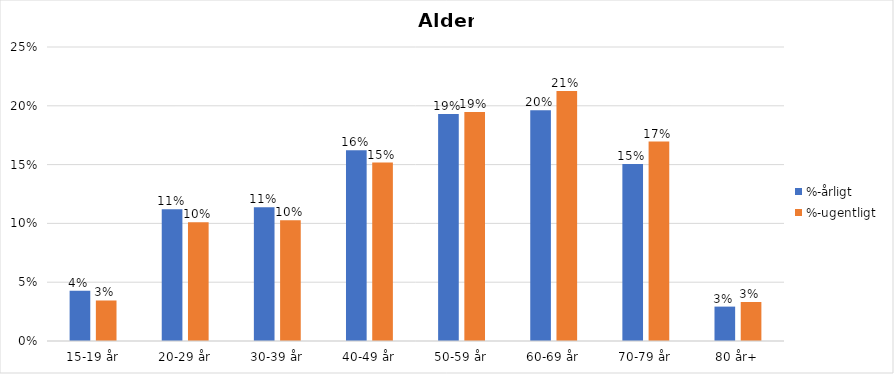
| Category | %-årligt | %-ugentligt |
|---|---|---|
| 15-19 år | 0.043 | 0.034 |
| 20-29 år | 0.112 | 0.101 |
| 30-39 år | 0.114 | 0.103 |
| 40-49 år | 0.162 | 0.152 |
| 50-59 år | 0.193 | 0.195 |
| 60-69 år | 0.196 | 0.213 |
| 70-79 år | 0.151 | 0.17 |
| 80 år+ | 0.029 | 0.033 |